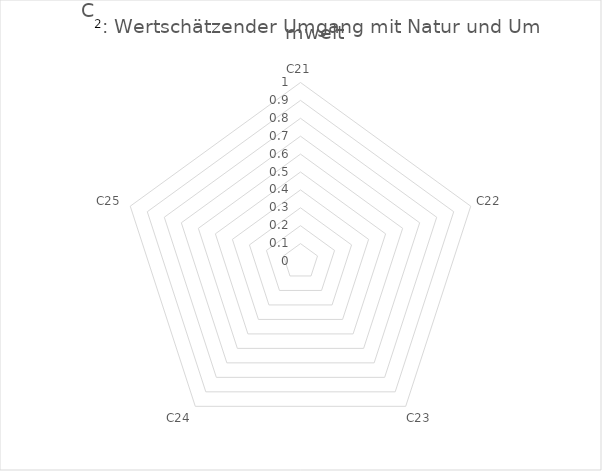
| Category | Series 0 |
|---|---|
| C21 | 0 |
| C22 | 0 |
| C23 | 0 |
| C24 | 0 |
| C25 | 0 |